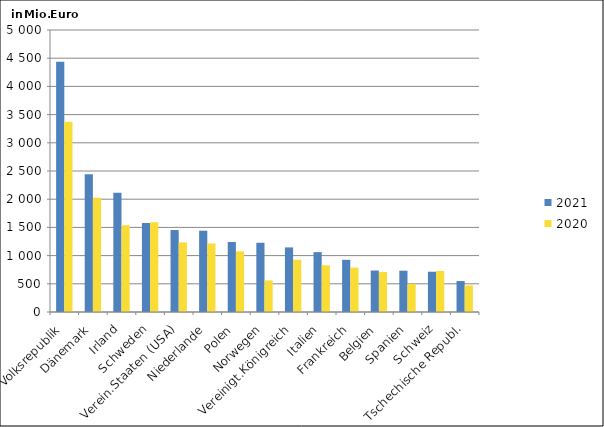
| Category | 2021 | 2020 |
|---|---|---|
| China, Volksrepublik | 4438.893 | 3374.705 |
| Dänemark | 2441.308 | 2026.345 |
| Irland | 2114.519 | 1537.744 |
| Schweden | 1579.786 | 1593.127 |
| Verein.Staaten (USA) | 1453.062 | 1233.92 |
| Niederlande | 1441.187 | 1214.695 |
| Polen | 1241.943 | 1075.352 |
| Norwegen | 1227.441 | 560.067 |
| Vereinigt.Königreich | 1145.085 | 926.013 |
| Italien | 1061.59 | 828.98 |
| Frankreich | 925.464 | 787.142 |
| Belgien | 735.752 | 707.411 |
| Spanien | 732.35 | 499.821 |
| Schweiz | 714.207 | 726.847 |
| Tschechische Republ. | 548.399 | 470.677 |